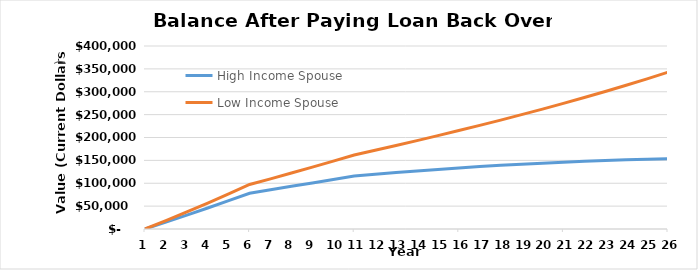
| Category | High Income Spouse | Low Income Spouse |
|---|---|---|
| 0 | 0 | 0 |
| 1 | 15070.317 | 18334.378 |
| 2 | 30394.277 | 37187.006 |
| 3 | 45993.322 | 56598.189 |
| 4 | 61889.732 | 76610.326 |
| 5 | 78106.666 | 97268.036 |
| 6 | 85710.453 | 109660.529 |
| 7 | 93256.012 | 122282.123 |
| 8 | 100748.989 | 135155.546 |
| 9 | 108195.135 | 148304.633 |
| 10 | 115600.307 | 161754.398 |
| 11 | 119530.481 | 172091.1 |
| 12 | 123267.435 | 182585.356 |
| 13 | 126902.158 | 193254.873 |
| 14 | 130252.033 | 204118.2 |
| 15 | 133403.37 | 215194.774 |
| 16 | 136353.858 | 226504.981 |
| 17 | 139100.929 | 238070.21 |
| 18 | 141641.753 | 249912.915 |
| 19 | 143973.229 | 262056.677 |
| 20 | 146091.969 | 274526.276 |
| 21 | 147994.293 | 287347.756 |
| 22 | 149676.217 | 300548.508 |
| 23 | 151133.438 | 314157.346 |
| 24 | 152361.321 | 328204.591 |
| 25 | 153354.893 | 342722.16 |